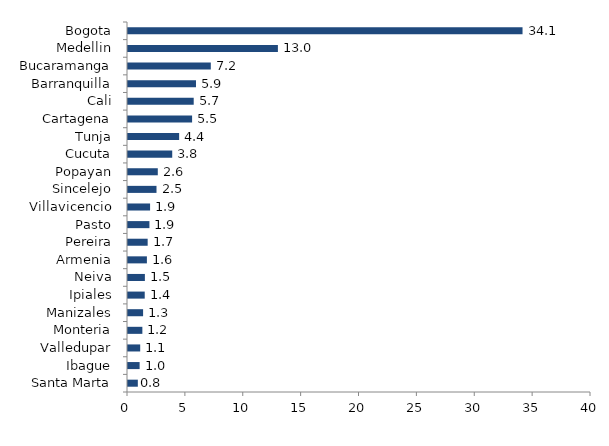
| Category | Series 0 |
|---|---|
| Santa Marta | 0.849 |
| Ibague | 1.004 |
| Valledupar | 1.054 |
| Monteria | 1.241 |
| Manizales | 1.304 |
| Ipiales | 1.445 |
| Neiva | 1.458 |
| Armenia | 1.633 |
| Pereira | 1.699 |
| Pasto | 1.852 |
| Villavicencio | 1.908 |
| Sincelejo | 2.462 |
| Popayan | 2.574 |
| Cucuta | 3.821 |
| Tunja | 4.418 |
| Cartagena | 5.538 |
| Cali | 5.677 |
| Barranquilla | 5.874 |
| Bucaramanga | 7.153 |
| Medellin | 12.951 |
| Bogota | 34.085 |